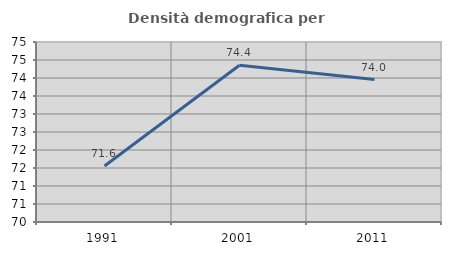
| Category | Densità demografica |
|---|---|
| 1991.0 | 71.557 |
| 2001.0 | 74.355 |
| 2011.0 | 73.956 |